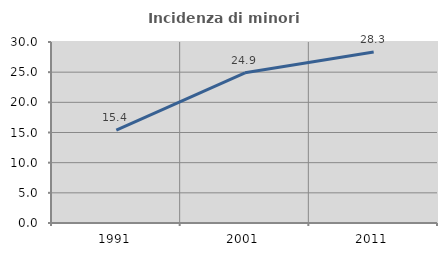
| Category | Incidenza di minori stranieri |
|---|---|
| 1991.0 | 15.385 |
| 2001.0 | 24.896 |
| 2011.0 | 28.342 |